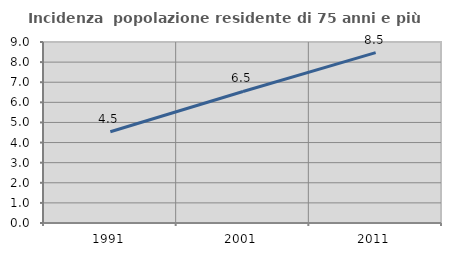
| Category | Incidenza  popolazione residente di 75 anni e più |
|---|---|
| 1991.0 | 4.54 |
| 2001.0 | 6.539 |
| 2011.0 | 8.474 |